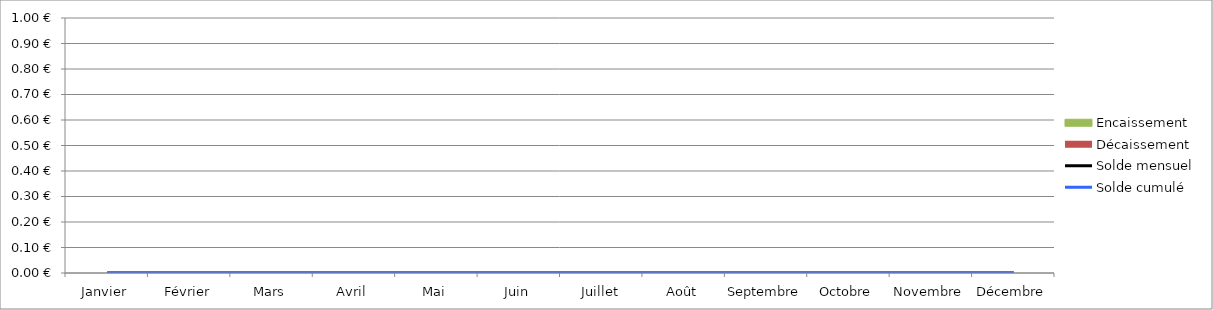
| Category | Encaissement | Décaissement |
|---|---|---|
| Janvier | 0 | 0 |
| Février | 0 | 0 |
| Mars | 0 | 0 |
| Avril | 0 | 0 |
| Mai | 0 | 0 |
| Juin | 0 | 0 |
| Juillet | 0 | 0 |
| Août | 0 | 0 |
| Septembre | 0 | 0 |
| Octobre | 0 | 0 |
| Novembre | 0 | 0 |
| Décembre | 0 | 0 |